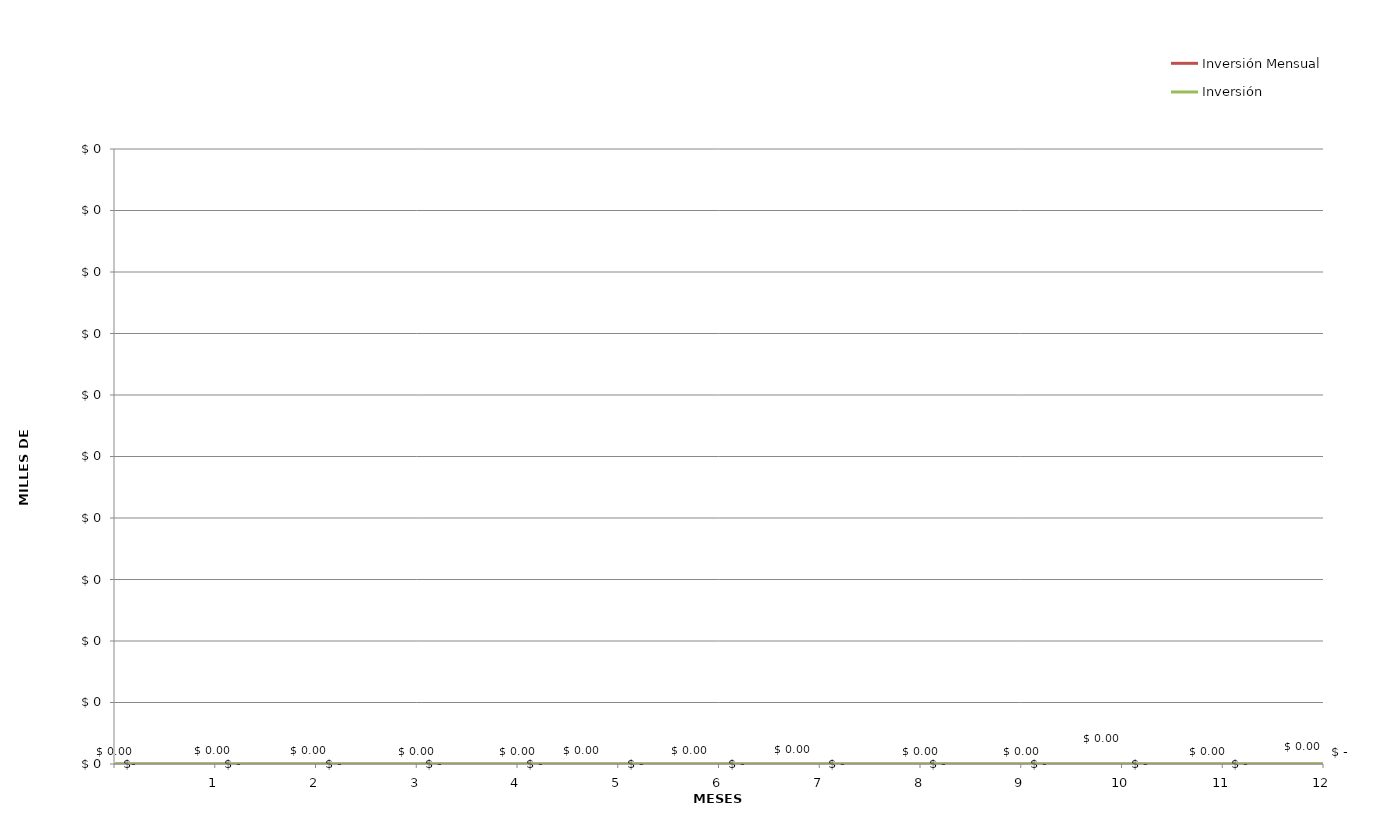
| Category | Inversión Mensual | Inversión Acumulada |
|---|---|---|
| nan | 0 | 0 |
| 1.0 | 0 | 0 |
| 2.0 | 0 | 0 |
| 3.0 | 0 | 0 |
| 4.0 | 0 | 0 |
| 5.0 | 0 | 0 |
| 6.0 | 0 | 0 |
| 7.0 | 0 | 0 |
| 8.0 | 0 | 0 |
| 9.0 | 0 | 0 |
| 10.0 | 0 | 0 |
| 11.0 | 0 | 0 |
| 12.0 | 0 | 0 |